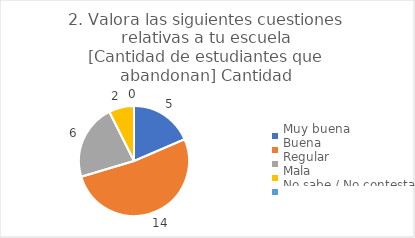
| Category | 2. Valora las siguientes cuestiones relativas a tu escuela
[Cantidad de estudiantes que abandonan] |
|---|---|
| Muy buena  | 0.185 |
| Buena  | 0.519 |
| Regular  | 0.222 |
| Mala  | 0.074 |
| No sabe / No contesta | 0 |